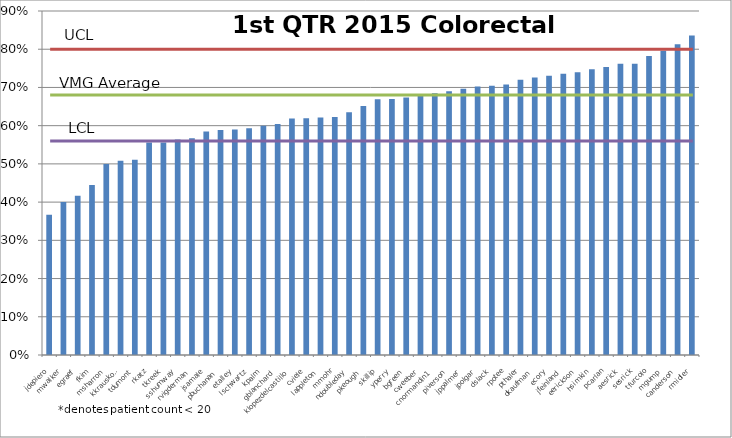
| Category | Series 0 |
|---|---|
| jdepiero | 0.367 |
| mwalker | 0.4 |
| egraef | 0.417 |
| fkim | 0.445 |
| msharron | 0.5 |
| kkrauskopf | 0.508 |
| tdumont | 0.511 |
| rkatz | 0.556 |
| tkreek | 0.556 |
| sshumway | 0.564 |
| rvigderman | 0.567 |
| jsamale | 0.585 |
| pbuchanan | 0.589 |
| etalley | 0.59 |
| lschwartz | 0.593 |
| kpalm | 0.6 |
| gblanchard | 0.604 |
| klopezdelcastillo | 0.618 |
| cviele | 0.619 |
| lappleton | 0.621 |
| mmohr | 0.623 |
| ndoubleday | 0.635 |
| pkeough | 0.651 |
| skillip | 0.669 |
| yperry | 0.67 |
| bgreen | 0.673 |
| cweeber | 0.68 |
| cnormandin1 | 0.685 |
| piverson | 0.69 |
| jppalmer | 0.697 |
| jpolgar | 0.702 |
| dslack | 0.705 |
| rpotee | 0.708 |
| pthaler | 0.72 |
| dkaufman | 0.726 |
| ecory | 0.731 |
| jfeinland | 0.736 |
| eerickson | 0.74 |
| hsimkin | 0.747 |
| pcarlan | 0.754 |
| aesrick | 0.762 |
| sesrick | 0.762 |
| tfurcolo | 0.782 |
| mgump | 0.796 |
| canderson | 0.813 |
| rmidler | 0.836 |